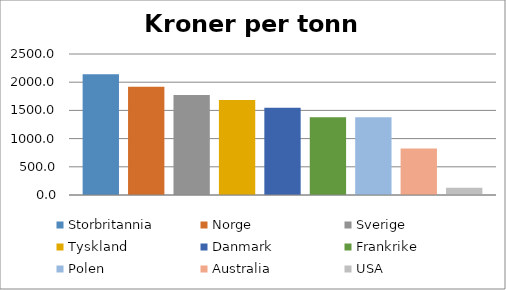
| Category | Storbritannia | Norge | Sverige | Tyskland | Danmark | Frankrike | Polen | Australia | USA |
|---|---|---|---|---|---|---|---|---|---|
|  | 2140.2 | 1918.8 | 1772.4 | 1683.5 | 1547.5 | 1377.5 | 1377.5 | 825.9 | 127 |